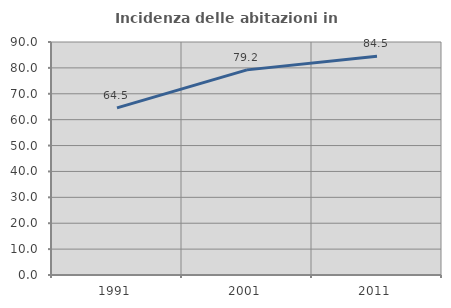
| Category | Incidenza delle abitazioni in proprietà  |
|---|---|
| 1991.0 | 64.545 |
| 2001.0 | 79.231 |
| 2011.0 | 84.527 |